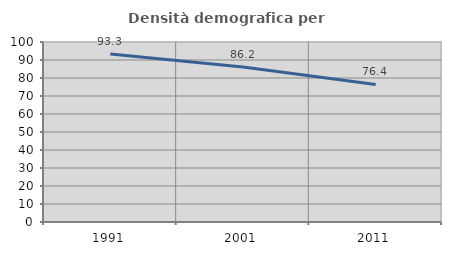
| Category | Densità demografica |
|---|---|
| 1991.0 | 93.27 |
| 2001.0 | 86.17 |
| 2011.0 | 76.407 |